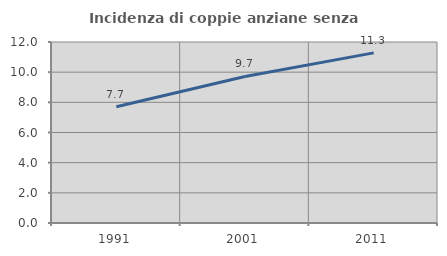
| Category | Incidenza di coppie anziane senza figli  |
|---|---|
| 1991.0 | 7.711 |
| 2001.0 | 9.714 |
| 2011.0 | 11.28 |